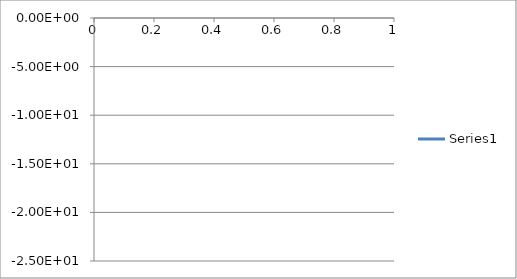
| Category | Series 0 |
|---|---|
| 0 | -22.605 |
| 1 | -19.306 |
| 2 | -17.083 |
| 3 | -15.824 |
| 4 | -14.996 |
| 5 | -14.292 |
| 6 | -13.956 |
| 7 | -13.601 |
| 8 | -13.21 |
| 9 | -13.3 |
| 10 | -12.817 |
| 11 | -12.403 |
| 12 | -11.781 |
| 13 | -11.604 |
| 14 | -11.817 |
| 15 | -11.742 |
| 16 | -11.496 |
| 17 | -11.178 |
| 18 | -10.641 |
| 19 | -10.18 |
| 20 | -9.711 |
| 21 | -9.277 |
| 22 | -8.842 |
| 23 | -8.449 |
| 24 | -8.195 |
| 25 | -7.694 |
| 26 | -7.458 |
| 27 | -6.989 |
| 28 | -6.889 |
| 29 | -6.601 |
| 30 | -6.813 |
| 31 | -5.888 |
| 32 | -5.099 |
| 33 | -4.737 |
| 34 | -4.62 |
| 35 | -4.503 |
| 36 | -4.408 |
| 37 | -4.489 |
| 38 | -4.72 |
| 39 | -4.96 |
| 40 | -5.422 |
| 41 | -5.413 |
| 42 | -4.849 |
| 43 | -4.483 |
| 44 | -4.391 |
| 45 | -4.489 |
| 46 | -4.69 |
| 47 | -4.81 |
| 48 | -5.041 |
| 49 | -5.222 |
| 50 | -5.712 |
| 51 | -6.514 |
| 52 | -7.802 |
| 53 | -10.386 |
| 54 | -12.852 |
| 55 | -11.841 |
| 56 | -9.906 |
| 57 | -9.333 |
| 58 | -9.086 |
| 59 | -9.353 |
| 60 | -9.685 |
| 61 | -10.223 |
| 62 | -10.585 |
| 63 | -11.186 |
| 64 | -11.915 |
| 65 | -12.691 |
| 66 | -13.628 |
| 67 | -14.26 |
| 68 | -15.56 |
| 69 | -15.771 |
| 70 | -16.885 |
| 71 | -17.962 |
| 72 | -18.43 |
| 73 | -18.867 |
| 74 | -18.944 |
| 75 | -19.19 |
| 76 | -19.015 |
| 77 | -19.755 |
| 78 | -18.327 |
| 79 | -16.469 |
| 80 | -14.431 |
| 81 | -12.294 |
| 82 | -11.483 |
| 83 | -10.27 |
| 84 | -9.571 |
| 85 | -8.781 |
| 86 | -8.562 |
| 87 | -8.099 |
| 88 | -7.95 |
| 89 | -7.646 |
| 90 | -6.888 |
| 91 | -6.599 |
| 92 | -5.911 |
| 93 | -5.621 |
| 94 | -5.143 |
| 95 | -4.857 |
| 96 | -4.55 |
| 97 | -4.323 |
| 98 | -4.251 |
| 99 | -4.055 |
| 100 | -4.146 |
| 101 | -3.912 |
| 102 | -4.076 |
| 103 | -4.009 |
| 104 | -4.208 |
| 105 | -4.291 |
| 106 | -4.372 |
| 107 | -4.788 |
| 108 | -4.895 |
| 109 | -5.313 |
| 110 | -5.34 |
| 111 | -5.793 |
| 112 | -6.036 |
| 113 | -6.556 |
| 114 | -7.307 |
| 115 | -7.6 |
| 116 | -8.166 |
| 117 | -7.903 |
| 118 | -7.7 |
| 119 | -6.984 |
| 120 | -6.08 |
| 121 | -5.436 |
| 122 | -4.557 |
| 123 | -4.274 |
| 124 | -3.643 |
| 125 | -3.4 |
| 126 | -3.061 |
| 127 | -2.858 |
| 128 | -2.84 |
| 129 | -2.628 |
| 130 | -2.684 |
| 131 | -2.363 |
| 132 | -2.471 |
| 133 | -2.291 |
| 134 | -2.338 |
| 135 | -2.366 |
| 136 | -2.182 |
| 137 | -2.377 |
| 138 | -2.262 |
| 139 | -2.42 |
| 140 | -2.254 |
| 141 | -2.4 |
| 142 | -2.615 |
| 143 | -2.825 |
| 144 | -3.114 |
| 145 | -2.823 |
| 146 | -2.767 |
| 147 | -2.628 |
| 148 | -2.769 |
| 149 | -2.808 |
| 150 | -2.874 |
| 151 | -2.8 |
| 152 | -2.625 |
| 153 | -2.86 |
| 154 | -2.683 |
| 155 | -2.793 |
| 156 | -2.78 |
| 157 | -2.706 |
| 158 | -2.805 |
| 159 | -2.81 |
| 160 | -2.948 |
| 161 | -2.926 |
| 162 | -3.12 |
| 163 | -3.177 |
| 164 | -3.572 |
| 165 | -3.808 |
| 166 | -4.056 |
| 167 | -4.54 |
| 168 | -4.696 |
| 169 | -4.922 |
| 170 | -4.854 |
| 171 | -4.904 |
| 172 | -4.819 |
| 173 | -4.975 |
| 174 | -5.358 |
| 175 | -5.456 |
| 176 | -5.73 |
| 177 | -5.302 |
| 178 | -5.179 |
| 179 | -4.837 |
| 180 | -4.6 |
| 181 | -4.457 |
| 182 | -4.244 |
| 183 | -4.483 |
| 184 | -4.171 |
| 185 | -4.331 |
| 186 | -4.144 |
| 187 | -4.125 |
| 188 | -4.149 |
| 189 | -4.073 |
| 190 | -4.15 |
| 191 | -3.896 |
| 192 | -4.104 |
| 193 | -3.908 |
| 194 | -4.005 |
| 195 | -4.018 |
| 196 | -3.881 |
| 197 | -3.969 |
| 198 | -3.665 |
| 199 | -3.808 |
| 200 | -3.462 |
| 201 | -3.493 |
| 202 | -3.219 |
| 203 | -3.103 |
| 204 | -3.277 |
| 205 | -3.043 |
| 206 | -3.191 |
| 207 | -2.928 |
| 208 | -3.131 |
| 209 | -2.959 |
| 210 | -2.895 |
| 211 | -2.959 |
| 212 | -2.587 |
| 213 | -2.876 |
| 214 | -2.592 |
| 215 | -2.66 |
| 216 | -2.449 |
| 217 | -2.293 |
| 218 | -2.331 |
| 219 | -2.091 |
| 220 | -2.214 |
| 221 | -1.903 |
| 222 | -2.002 |
| 223 | -1.857 |
| 224 | -1.828 |
| 225 | -1.905 |
| 226 | -1.702 |
| 227 | -1.861 |
| 228 | -1.628 |
| 229 | -1.761 |
| 230 | -1.598 |
| 231 | -1.669 |
| 232 | -1.664 |
| 233 | -1.545 |
| 234 | -1.692 |
| 235 | -1.503 |
| 236 | -1.687 |
| 237 | -1.552 |
| 238 | -1.642 |
| 239 | -1.673 |
| 240 | -1.616 |
| 241 | -1.752 |
| 242 | -1.674 |
| 243 | -1.868 |
| 244 | -1.784 |
| 245 | -1.933 |
| 246 | -1.904 |
| 247 | -2 |
| 248 | -2.177 |
| 249 | -2.061 |
| 250 | -2.363 |
| 251 | -2.215 |
| 252 | -2.573 |
| 253 | -2.56 |
| 254 | -2.781 |
| 255 | -2.917 |
| 256 | -2.991 |
| 257 | -3.381 |
| 258 | -3.316 |
| 259 | -3.806 |
| 260 | -3.849 |
| 261 | -4.233 |
| 262 | -4.435 |
| 263 | -4.63 |
| 264 | -5.149 |
| 265 | -5.117 |
| 266 | -5.666 |
| 267 | -5.624 |
| 268 | -5.944 |
| 269 | -6.013 |
| 270 | -5.786 |
| 271 | -6.043 |
| 272 | -5.561 |
| 273 | -5.715 |
| 274 | -5.246 |
| 275 | -5.203 |
| 276 | -4.883 |
| 277 | -4.655 |
| 278 | -4.596 |
| 279 | -4.01 |
| 280 | -4.08 |
| 281 | -3.6 |
| 282 | -3.474 |
| 283 | -3.31 |
| 284 | -3.004 |
| 285 | -3.047 |
| 286 | -2.681 |
| 287 | -2.668 |
| 288 | -2.38 |
| 289 | -2.307 |
| 290 | -2.183 |
| 291 | -1.918 |
| 292 | -1.954 |
| 293 | -1.747 |
| 294 | -1.802 |
| 295 | -1.567 |
| 296 | -1.646 |
| 297 | -1.364 |
| 298 | -1.392 |
| 299 | -1.43 |
| 300 | -1.284 |
| 301 | -1.323 |
| 302 | -1.128 |
| 303 | -1.234 |
| 304 | -1.068 |
| 305 | -0.998 |
| 306 | -1.062 |
| 307 | -1.043 |
| 308 | -1.084 |
| 309 | -0.878 |
| 310 | -0.981 |
| 311 | -0.827 |
| 312 | -0.89 |
| 313 | -0.864 |
| 314 | -0.801 |
| 315 | -0.881 |
| 316 | -0.66 |
| 317 | -0.866 |
| 318 | -0.773 |
| 319 | -0.873 |
| 320 | -0.756 |
| 321 | -0.656 |
| 322 | -0.852 |
| 323 | -0.667 |
| 324 | -0.862 |
| 325 | -0.684 |
| 326 | -0.755 |
| 327 | -0.742 |
| 328 | -0.671 |
| 329 | -0.789 |
| 330 | -0.694 |
| 331 | -0.859 |
| 332 | -0.672 |
| 333 | -0.701 |
| 334 | -0.733 |
| 335 | -0.69 |
| 336 | -0.827 |
| 337 | -0.717 |
| 338 | -0.88 |
| 339 | -0.81 |
| 340 | -0.925 |
| 341 | -0.852 |
| 342 | -0.905 |
| 343 | -0.994 |
| 344 | -0.997 |
| 345 | -1.146 |
| 346 | -1.109 |
| 347 | -1.293 |
| 348 | -1.234 |
| 349 | -1.265 |
| 350 | -1.317 |
| 351 | -1.242 |
| 352 | -1.328 |
| 353 | -1.193 |
| 354 | -1.261 |
| 355 | -1.133 |
| 356 | -1.116 |
| 357 | -1.088 |
| 358 | -1.036 |
| 359 | -1.003 |
| 360 | -1.012 |
| 361 | -1.015 |
| 362 | -0.902 |
| 363 | -0.979 |
| 364 | -0.896 |
| 365 | -0.969 |
| 366 | -0.902 |
| 367 | -0.919 |
| 368 | -0.972 |
| 369 | -0.868 |
| 370 | -0.878 |
| 371 | -0.766 |
| 372 | -1.068 |
| 373 | -0.83 |
| 374 | -0.994 |
| 375 | -0.962 |
| 376 | -0.801 |
| 377 | -1.097 |
| 378 | -0.824 |
| 379 | -1.15 |
| 380 | -0.983 |
| 381 | -1.116 |
| 382 | -1.216 |
| 383 | -1.08 |
| 384 | -1.41 |
| 385 | -1.136 |
| 386 | -1.56 |
| 387 | -1.397 |
| 388 | -1.67 |
| 389 | -1.81 |
| 390 | -1.773 |
| 391 | -2.263 |
| 392 | -1.896 |
| 393 | -2.408 |
| 394 | -2.204 |
| 395 | -2.42 |
| 396 | -2.514 |
| 397 | -2.187 |
| 398 | -2.581 |
| 399 | -1.956 |
| 400 | -2.255 |